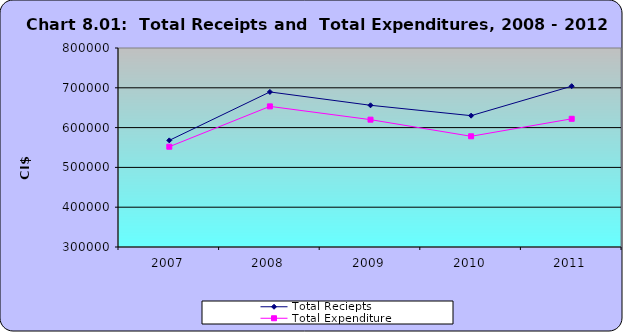
| Category | Total Reciepts | Total Expenditure |
|---|---|---|
| 2007.0 | 567895 | 551989 |
| 2008.0 | 689582 | 653328 |
| 2009.0 | 656060 | 619968 |
| 2010.0 | 630007 | 578161 |
| 2011.0 | 704058 | 622112 |